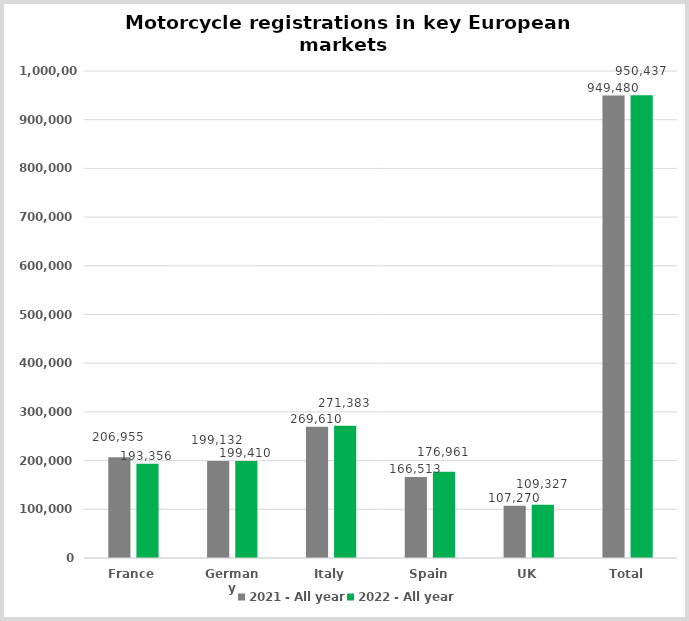
| Category | 2021 - All year | 2022 - All year |
|---|---|---|
| France | 206955 | 193356 |
| Germany | 199132 | 199410 |
| Italy | 269610 | 271383 |
| Spain | 166513 | 176961 |
| UK | 107270 | 109327 |
| Total | 949480 | 950437 |